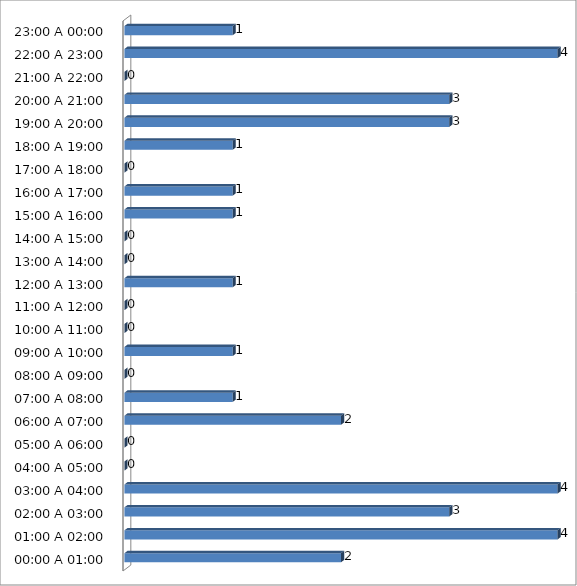
| Category | Series 0 |
|---|---|
| 00:00 A 01:00 | 2 |
| 01:00 A 02:00 | 4 |
| 02:00 A 03:00 | 3 |
| 03:00 A 04:00 | 4 |
| 04:00 A 05:00 | 0 |
| 05:00 A 06:00 | 0 |
| 06:00 A 07:00 | 2 |
| 07:00 A 08:00 | 1 |
| 08:00 A 09:00 | 0 |
| 09:00 A 10:00 | 1 |
| 10:00 A 11:00 | 0 |
| 11:00 A 12:00 | 0 |
| 12:00 A 13:00 | 1 |
| 13:00 A 14:00 | 0 |
| 14:00 A 15:00 | 0 |
| 15:00 A 16:00 | 1 |
| 16:00 A 17:00 | 1 |
| 17:00 A 18:00 | 0 |
| 18:00 A 19:00 | 1 |
| 19:00 A 20:00 | 3 |
| 20:00 A 21:00 | 3 |
| 21:00 A 22:00 | 0 |
| 22:00 A 23:00 | 4 |
| 23:00 A 00:00 | 1 |